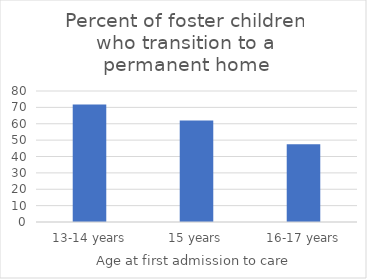
| Category | Series 0 |
|---|---|
| 13-14 years | 71.7 |
| 15 years | 62 |
| 16-17 years | 47.5 |